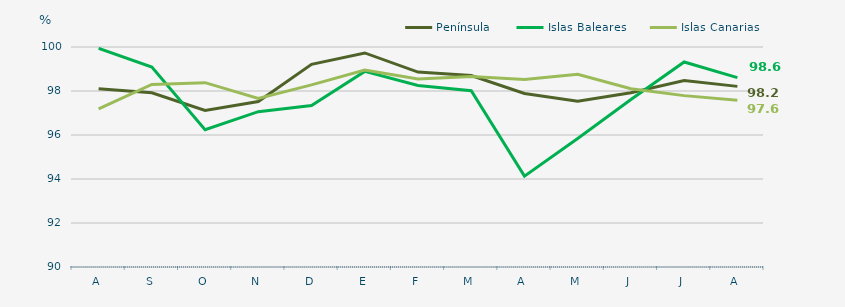
| Category | Península | Islas Baleares | Islas Canarias |
|---|---|---|---|
| A | 98.1 | 99.94 | 97.19 |
| S | 97.92 | 99.09 | 98.3 |
| O | 97.12 | 96.24 | 98.38 |
| N | 97.52 | 97.06 | 97.66 |
| D | 99.21 | 97.34 | 98.28 |
| E | 99.73 | 98.89 | 98.95 |
| F | 98.86 | 98.25 | 98.55 |
| M | 98.7 | 98.01 | 98.66 |
| A | 97.89 | 94.13 | 98.52 |
| M | 97.53 | 95.84 | 98.76 |
| J | 97.92 | 97.61 | 98.1 |
| J | 98.48 | 99.32 | 97.79 |
| A | 98.21 | 98.61 | 97.58 |